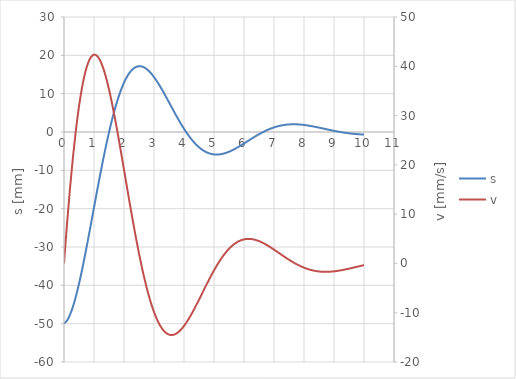
| Category | s |
|---|---|
| 0.0 | -50 |
| 0.1 | -49.2 |
| 0.2 | -47.677 |
| 0.30000000000000004 | -45.513 |
| 0.4 | -42.793 |
| 0.5 | -39.607 |
| 0.6 | -36.042 |
| 0.7 | -32.185 |
| 0.7999999999999999 | -28.122 |
| 0.8999999999999999 | -23.934 |
| 0.9999999999999999 | -19.698 |
| 1.0999999999999999 | -15.486 |
| 1.2 | -11.363 |
| 1.3 | -7.388 |
| 1.4000000000000001 | -3.613 |
| 1.5000000000000002 | -0.082 |
| 1.6000000000000003 | 3.168 |
| 1.7000000000000004 | 6.107 |
| 1.8000000000000005 | 8.713 |
| 1.9000000000000006 | 10.972 |
| 2.0000000000000004 | 12.874 |
| 2.1000000000000005 | 14.418 |
| 2.2000000000000006 | 15.608 |
| 2.3000000000000007 | 16.453 |
| 2.400000000000001 | 16.967 |
| 2.500000000000001 | 17.168 |
| 2.600000000000001 | 17.079 |
| 2.700000000000001 | 16.723 |
| 2.800000000000001 | 16.129 |
| 2.9000000000000012 | 15.324 |
| 3.0000000000000013 | 14.338 |
| 3.1000000000000014 | 13.201 |
| 3.2000000000000015 | 11.945 |
| 3.3000000000000016 | 10.597 |
| 3.4000000000000017 | 9.188 |
| 3.5000000000000018 | 7.745 |
| 3.600000000000002 | 6.293 |
| 3.700000000000002 | 4.857 |
| 3.800000000000002 | 3.458 |
| 3.900000000000002 | 2.115 |
| 4.000000000000002 | 0.846 |
| 4.100000000000001 | -0.335 |
| 4.200000000000001 | -1.416 |
| 4.300000000000001 | -2.388 |
| 4.4 | -3.244 |
| 4.5 | -3.98 |
| 4.6 | -4.593 |
| 4.699999999999999 | -5.083 |
| 4.799999999999999 | -5.453 |
| 4.899999999999999 | -5.707 |
| 4.999999999999998 | -5.848 |
| 5.099999999999998 | -5.885 |
| 5.1999999999999975 | -5.824 |
| 5.299999999999997 | -5.676 |
| 5.399999999999997 | -5.448 |
| 5.4999999999999964 | -5.151 |
| 5.599999999999996 | -4.796 |
| 5.699999999999996 | -4.392 |
| 5.799999999999995 | -3.951 |
| 5.899999999999995 | -3.481 |
| 5.999999999999995 | -2.994 |
| 6.099999999999994 | -2.497 |
| 6.199999999999994 | -2 |
| 6.299999999999994 | -1.511 |
| 6.399999999999993 | -1.037 |
| 6.499999999999993 | -0.585 |
| 6.5999999999999925 | -0.159 |
| 6.699999999999992 | 0.236 |
| 6.799999999999992 | 0.595 |
| 6.8999999999999915 | 0.916 |
| 6.999999999999991 | 1.196 |
| 7.099999999999991 | 1.435 |
| 7.19999999999999 | 1.632 |
| 7.29999999999999 | 1.787 |
| 7.39999999999999 | 1.901 |
| 7.499999999999989 | 1.975 |
| 7.599999999999989 | 2.012 |
| 7.699999999999989 | 2.014 |
| 7.799999999999988 | 1.983 |
| 7.899999999999988 | 1.923 |
| 7.999999999999988 | 1.838 |
| 8.099999999999987 | 1.729 |
| 8.199999999999987 | 1.602 |
| 8.299999999999986 | 1.459 |
| 8.399999999999986 | 1.304 |
| 8.499999999999986 | 1.141 |
| 8.599999999999985 | 0.972 |
| 8.699999999999985 | 0.802 |
| 8.799999999999985 | 0.632 |
| 8.899999999999984 | 0.466 |
| 8.999999999999984 | 0.306 |
| 9.099999999999984 | 0.153 |
| 9.199999999999983 | 0.01 |
| 9.299999999999983 | -0.121 |
| 9.399999999999983 | -0.24 |
| 9.499999999999982 | -0.346 |
| 9.599999999999982 | -0.437 |
| 9.699999999999982 | -0.515 |
| 9.799999999999981 | -0.578 |
| 9.89999999999998 | -0.626 |
| 9.99999999999998 | -0.661 |